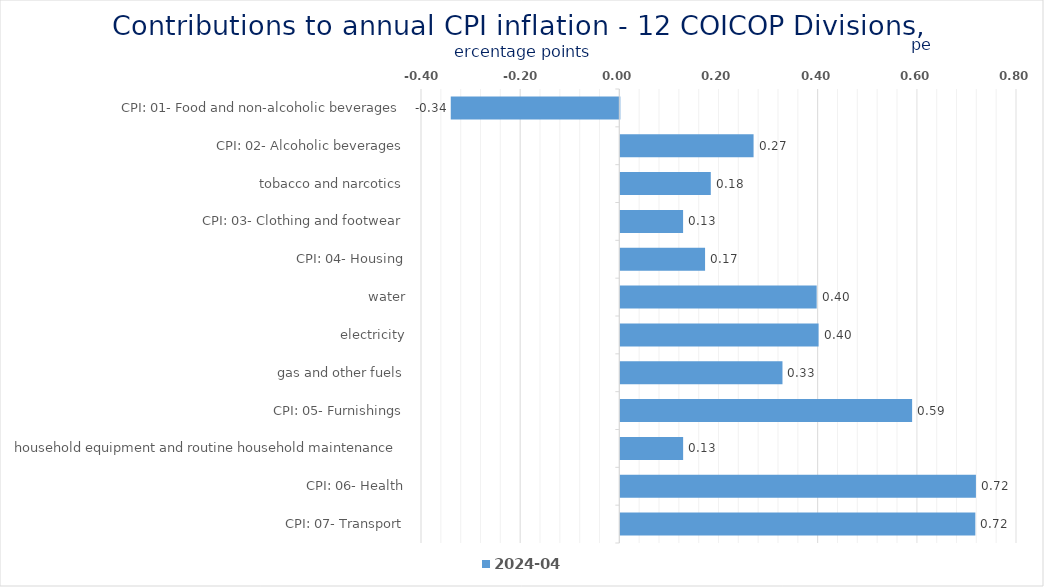
| Category | 2024-04 |
|---|---|
| CPI: 01- Food and non-alcoholic beverages | -0.34 |
| CPI: 02- Alcoholic beverages, tobacco and narcotics | 0.269 |
| CPI: 03- Clothing and footwear | 0.182 |
| CPI: 04- Housing, water, electricity, gas and other fuels | 0.127 |
| CPI: 05- Furnishings, household equipment and routine household maintenance | 0.171 |
| CPI: 06- Health | 0.396 |
| CPI: 07- Transport | 0.4 |
| CPI: 08- Communication | 0.327 |
| CPI: 09- Recreation and culture | 0.588 |
| CPI: 10- Education | 0.127 |
| CPI: 11- Restaurants and hotels | 0.717 |
| CPI: 12- Miscellaneous goods and services | 0.716 |